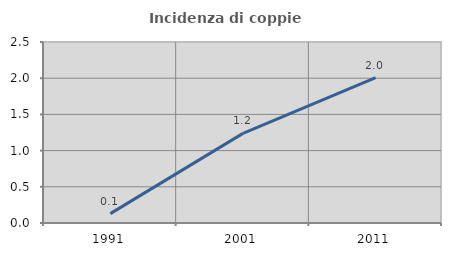
| Category | Incidenza di coppie miste |
|---|---|
| 1991.0 | 0.129 |
| 2001.0 | 1.238 |
| 2011.0 | 2.009 |